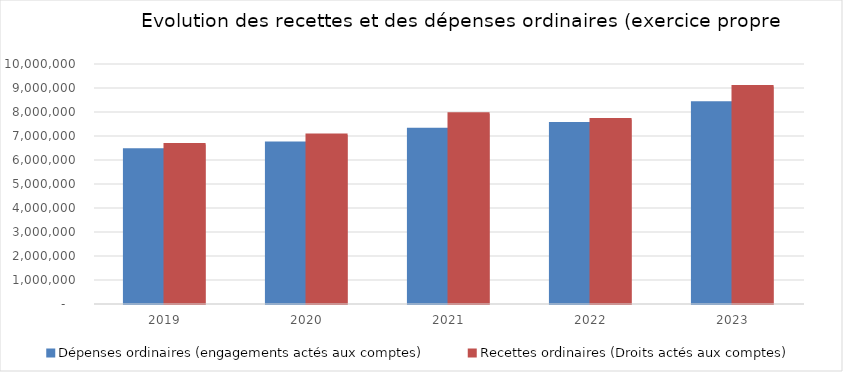
| Category | Dépenses ordinaires (engagements actés aux comptes) | Recettes ordinaires (Droits actés aux comptes) |
|---|---|---|
| 2019.0 | 6428505 | 6646954.11 |
| 2020.0 | 6704734.67 | 7045824.34 |
| 2021.0 | 7285594.18 | 7925469 |
| 2022.0 | 7516154.26 | 7683384.48 |
| 2023.0 | 8388074.63 | 9060874.69 |